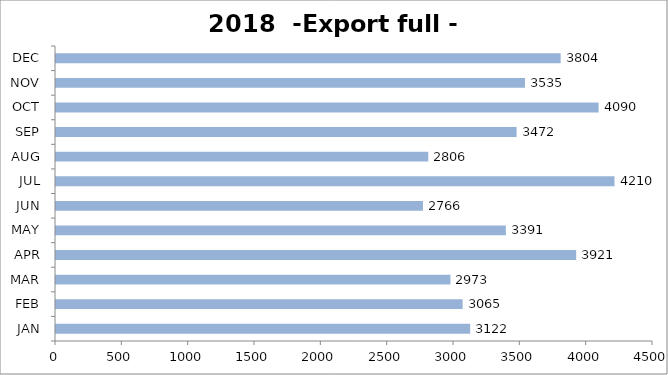
| Category | Export full - 20' |
|---|---|
| JAN | 3122 |
| FEB | 3065 |
| MAR | 2973 |
| APR | 3921 |
| MAY | 3391 |
| JUN | 2766 |
| JUL | 4210 |
| AUG | 2806 |
| SEP | 3472 |
| OCT | 4090 |
| NOV | 3535 |
| DEC | 3804 |